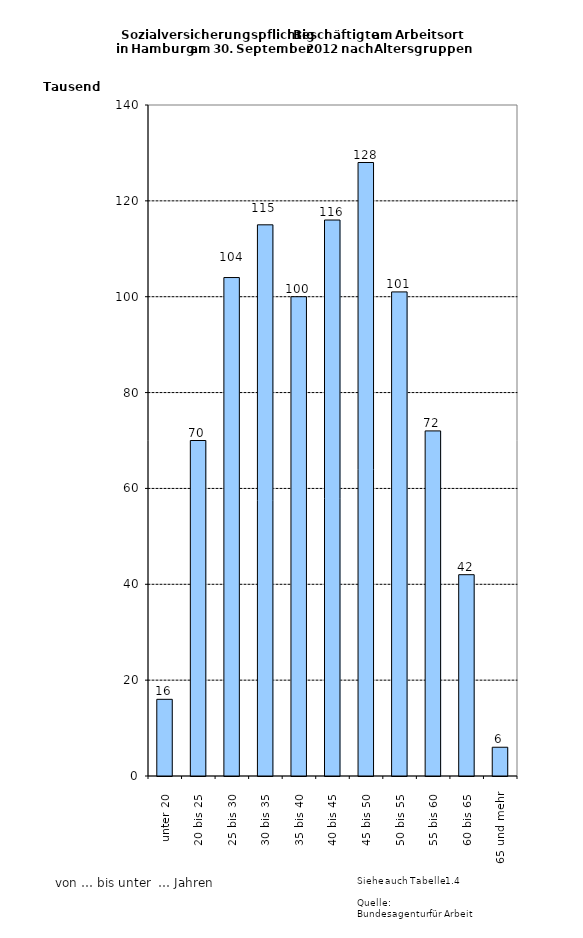
| Category | Series 0 |
|---|---|
| unter 20 | 16000 |
| 20 bis 25 | 70000 |
| 25 bis 30 | 104000 |
| 30 bis 35 | 115000 |
| 35 bis 40 | 100000 |
| 40 bis 45 | 116000 |
| 45 bis 50 | 128000 |
| 50 bis 55 | 101000 |
| 55 bis 60 | 72000 |
| 60 bis 65 | 42000 |
| 65 und mehr | 6000 |